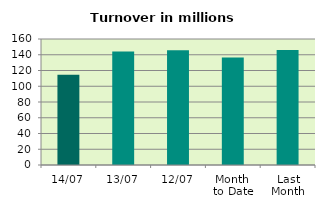
| Category | Series 0 |
|---|---|
| 14/07 | 114.448 |
| 13/07 | 144.15 |
| 12/07 | 145.796 |
| Month 
to Date | 136.597 |
| Last
Month | 145.879 |